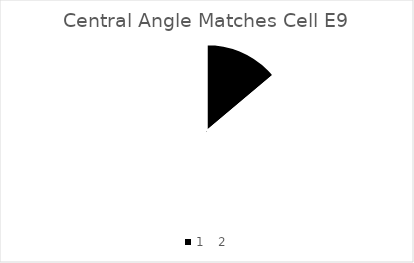
| Category | Series 0 |
|---|---|
| 0 | 50 |
| 1 | 310 |